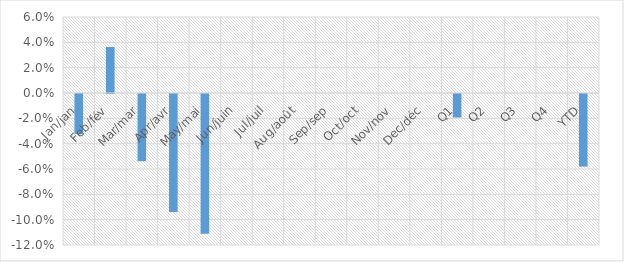
| Category | Total YoY % Change |
|---|---|
| Jan/jan | -0.032 |
| Feb/fév | 0.036 |
| Mar/mar | -0.053 |
| Apr/avr | -0.093 |
| May/mai | -0.11 |
| Jun/juin | 0 |
| Jul/juil | 0 |
| Aug/août | 0 |
| Sep/sep | 0 |
| Oct/oct | 0 |
| Nov/nov | 0 |
| Dec/déc | 0 |
| Q1 | -0.019 |
| Q2 | 0 |
| Q3 | 0 |
| Q4 | 0 |
| YTD | -0.057 |